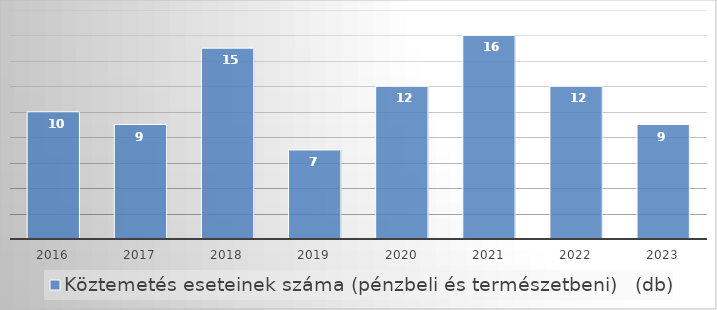
| Category | Köztemetés eseteinek száma (pénzbeli és természetbeni)   (db) |
|---|---|
| 2016.0 | 10 |
| 2017.0 | 9 |
| 2018.0 | 15 |
| 2019.0 | 7 |
| 2020.0 | 12 |
| 2021.0 | 16 |
| 2022.0 | 12 |
| 2023.0 | 9 |